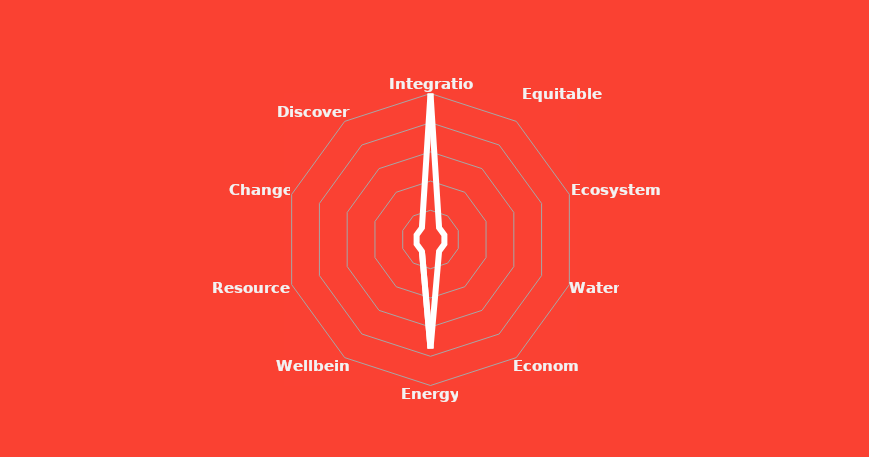
| Category | Series 0 |
|---|---|
| Integration | 10 |
| Equitable
 Communities  | 1 |
| Ecosystems | 1 |
| Water | 1 |
| Economy | 1 |
| Energy | 7.462 |
| Wellbeing | 1 |
| Resources | 1 |
| Change | 1 |
| Discovery | 1 |